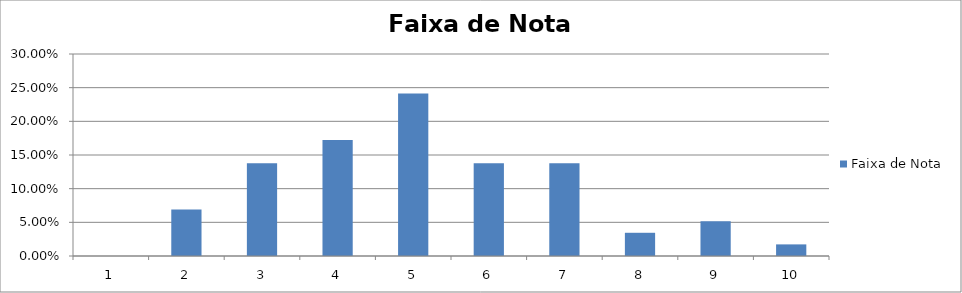
| Category | Faixa de Nota |
|---|---|
| 0 | 0 |
| 1 | 0.069 |
| 2 | 0.138 |
| 3 | 0.172 |
| 4 | 0.241 |
| 5 | 0.138 |
| 6 | 0.138 |
| 7 | 0.034 |
| 8 | 0.052 |
| 9 | 0.017 |